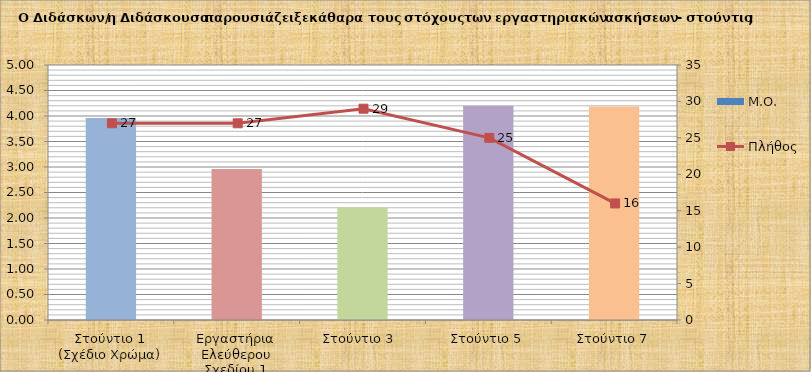
| Category | Μ.Ο. |
|---|---|
| Στούντιο 1 (Σχέδιο Χρώμα) | 3.963 |
| Εργαστήρια Ελεύθερου Σχεδίου 1 | 2.963 |
| Στούντιο 3  | 2.207 |
| Στούντιο 5 | 4.2 |
| Στούντιο 7 | 4.188 |